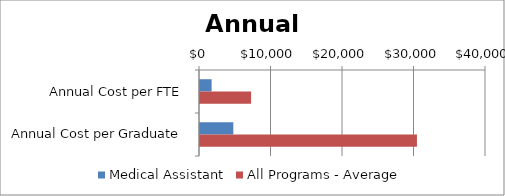
| Category | Medical Assistant | All Programs - Average |
|---|---|---|
| Annual Cost per FTE | 1625.435 | 7144 |
| Annual Cost per Graduate | 4659.579 | 30340 |